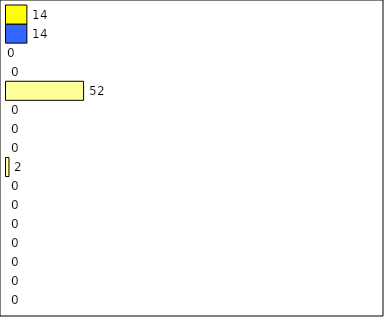
| Category | -2 | -1 | 0 | 1 | 2 | 3 | 4 | 5 | 6 | 7 | 8 | 9 | 10 | 11 | 12 | Perfect Round |
|---|---|---|---|---|---|---|---|---|---|---|---|---|---|---|---|---|
| 0 | 0 | 0 | 0 | 0 | 0 | 0 | 0 | 2 | 0 | 0 | 0 | 52 | 0 | 0 | 14 | 14 |